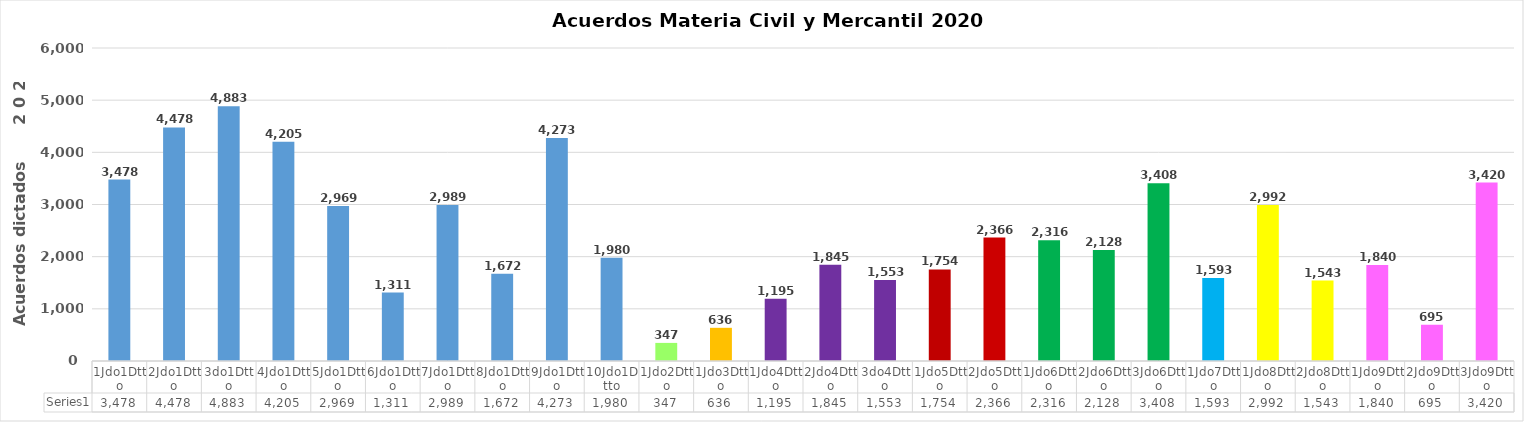
| Category | Series 0 |
|---|---|
| 1Jdo1Dtto | 3478 |
| 2Jdo1Dtto | 4478 |
| 3do1Dtto | 4883 |
| 4Jdo1Dtto | 4205 |
| 5Jdo1Dtto | 2969 |
| 6Jdo1Dtto | 1311 |
| 7Jdo1Dtto | 2989 |
| 8Jdo1Dtto | 1672 |
| 9Jdo1Dtto | 4273 |
| 10Jdo1Dtto | 1980 |
| 1Jdo2Dtto | 347 |
| 1Jdo3Dtto | 636 |
| 1Jdo4Dtto | 1195 |
| 2Jdo4Dtto | 1845 |
| 3do4Dtto | 1553 |
| 1Jdo5Dtto | 1754 |
| 2Jdo5Dtto | 2366 |
| 1Jdo6Dtto | 2316 |
| 2Jdo6Dtto | 2128 |
| 3Jdo6Dtto | 3408 |
| 1Jdo7Dtto | 1593 |
| 1Jdo8Dtto | 2992 |
| 2Jdo8Dtto | 1543 |
| 1Jdo9Dtto | 1840 |
| 2Jdo9Dtto | 695 |
| 3Jdo9Dtto | 3420 |